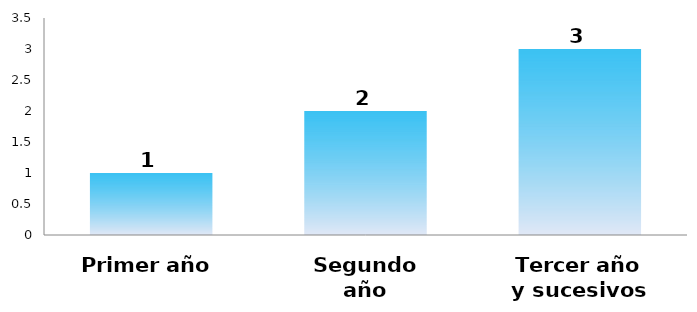
| Category | Series 0 |
|---|---|
| Primer año | 1 |
| Segundo año | 2 |
| Tercer año y sucesivos | 3 |